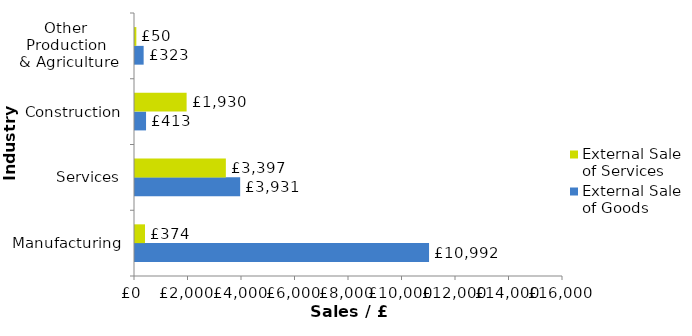
| Category | External Sale of Goods | External Sale of Services |
|---|---|---|
| Manufacturing | 10992.117 | 374.287 |
| Services | 3931.296 | 3396.566 |
| Construction | 412.707 | 1929.514 |
| Other 
Production 
& Agriculture
 | 323.23 | 50.254 |